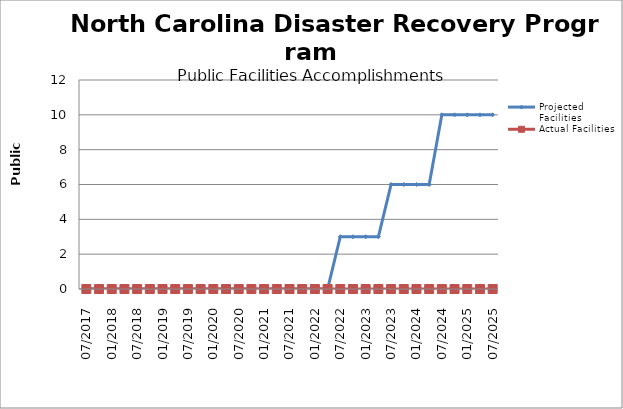
| Category | Projected Facilities | Actual Facilities |
|---|---|---|
| 07/2017 | 0 | 0 |
| 10/2017 | 0 | 0 |
| 01/2018 | 0 | 0 |
| 4/2018 | 0 | 0 |
| 07/2018 | 0 | 0 |
| 10/2018 | 0 | 0 |
| 01/2019 | 0 | 0 |
| 4/2019 | 0 | 0 |
| 07/2019 | 0 | 0 |
| 10/2019 | 0 | 0 |
| 01/2020 | 0 | 0 |
| 4/2020 | 0 | 0 |
| 07/2020 | 0 | 0 |
| 10/2020 | 0 | 0 |
| 01/2021 | 0 | 0 |
| 4/2021 | 0 | 0 |
| 07/2021 | 0 | 0 |
| 10/2021 | 0 | 0 |
| 01/2022 | 0 | 0 |
| 4/2022 | 0 | 0 |
| 07/2022 | 3 | 0 |
| 10/2022 | 3 | 0 |
| 01/2023 | 3 | 0 |
| 4/2023 | 3 | 0 |
| 07/2023 | 6 | 0 |
| 10/2023 | 6 | 0 |
| 01/2024 | 6 | 0 |
| 4/2024 | 6 | 0 |
| 07/2024 | 10 | 0 |
| 10/2024 | 10 | 0 |
| 01/2025 | 10 | 0 |
| 4/2025 | 10 | 0 |
| 07/2025 | 10 | 0 |